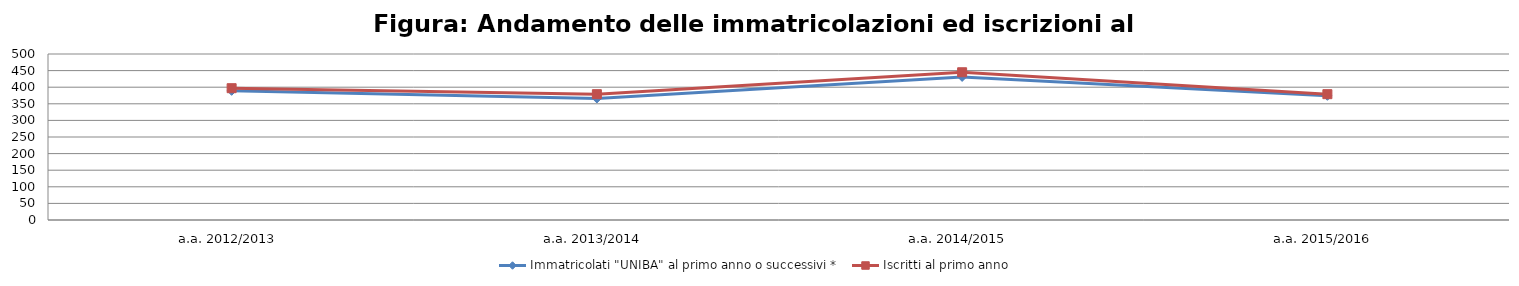
| Category | Immatricolati "UNIBA" al primo anno o successivi * | Iscritti al primo anno  |
|---|---|---|
| a.a. 2012/2013 | 389 | 397 |
| a.a. 2013/2014 | 366 | 379 |
| a.a. 2014/2015 | 431 | 445 |
| a.a. 2015/2016 | 374 | 379 |